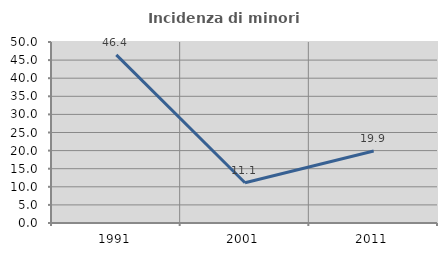
| Category | Incidenza di minori stranieri |
|---|---|
| 1991.0 | 46.429 |
| 2001.0 | 11.111 |
| 2011.0 | 19.91 |